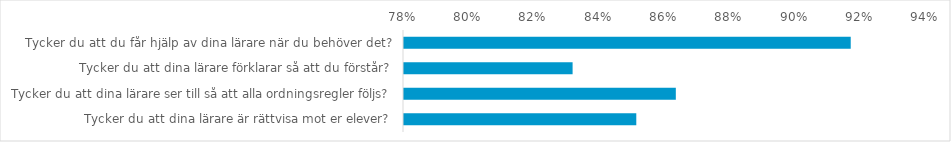
| Category | (Alla) |
|---|---|
| Tycker du att du får hjälp av dina lärare när du behöver det? | 0.917 |
| Tycker du att dina lärare förklarar så att du förstår? | 0.832 |
| Tycker du att dina lärare ser till så att alla ordningsregler följs? | 0.863 |
| Tycker du att dina lärare är rättvisa mot er elever? | 0.851 |